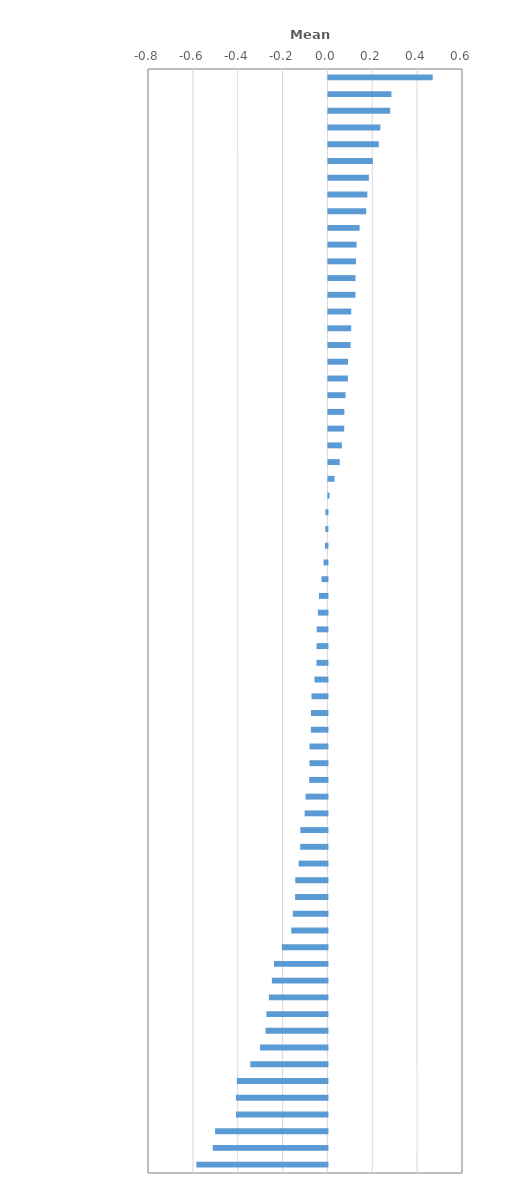
| Category | Difference in the index of students' awareness of global issues by : |
|---|---|
| Albania | 0.465 |
| Lithuania | 0.281 |
| Greece | 0.275 |
| Malta | 0.232 |
| United Arab Emirates | 0.225 |
| Portugal | 0.198 |
| Kosovo | 0.181 |
| Jordan | 0.173 |
| Croatia | 0.168 |
| Canada | 0.139 |
| Turkey | 0.126 |
| Ireland | 0.123 |
| Montenegro | 0.121 |
| Russia | 0.12 |
| North Macedonia | 0.102 |
| Poland | 0.101 |
| Australia | 0.099 |
| Scotland (United Kingdom) | 0.087 |
| Kazakhstan | 0.087 |
| Baku (Azerbaijan) | 0.076 |
| Serbia | 0.071 |
| Peru | 0.07 |
| Germany | 0.06 |
| France | 0.05 |
| Spain | 0.027 |
| OECD average | 0.005 |
| Singapore | -0.009 |
| Slovenia | -0.01 |
| Estonia | -0.011 |
| Austria | -0.017 |
| Italy | -0.026 |
| Moldova | -0.038 |
| Mexico | -0.043 |
| Hungary | -0.048 |
| Bosnia and Herzegovina | -0.048 |
| Costa Rica | -0.049 |
| New Zealand | -0.058 |
| Dominican Republic | -0.071 |
| Bulgaria | -0.073 |
| Chinese Taipei | -0.073 |
| Belarus | -0.08 |
| Ukraine | -0.08 |
| Panama | -0.082 |
| Hong Kong (China) | -0.098 |
| Chile | -0.102 |
| Switzerland | -0.121 |
| Philippines | -0.122 |
| Iceland | -0.128 |
| Colombia | -0.144 |
| Latvia | -0.144 |
| Israel | -0.155 |
| Slovak Republic | -0.161 |
| Uruguay | -0.203 |
| Brazil | -0.238 |
| Thailand | -0.248 |
| Korea | -0.261 |
| Lebanon | -0.272 |
| Macao (China) | -0.276 |
| Morocco | -0.301 |
| Viet Nam | -0.344 |
| Romania | -0.404 |
| Malaysia | -0.408 |
| Argentina | -0.408 |
| Saudi Arabia | -0.501 |
| Indonesia | -0.511 |
| Brunei Darussalam | -0.584 |